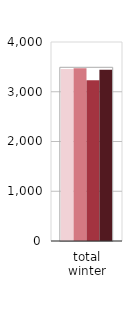
| Category | 2021−22 | 2022−23 | 2023−24 | 2024−25 |
|---|---|---|---|---|
| total winter | 3456.22 | 3472.484 | 3231.95 | 3440.516 |